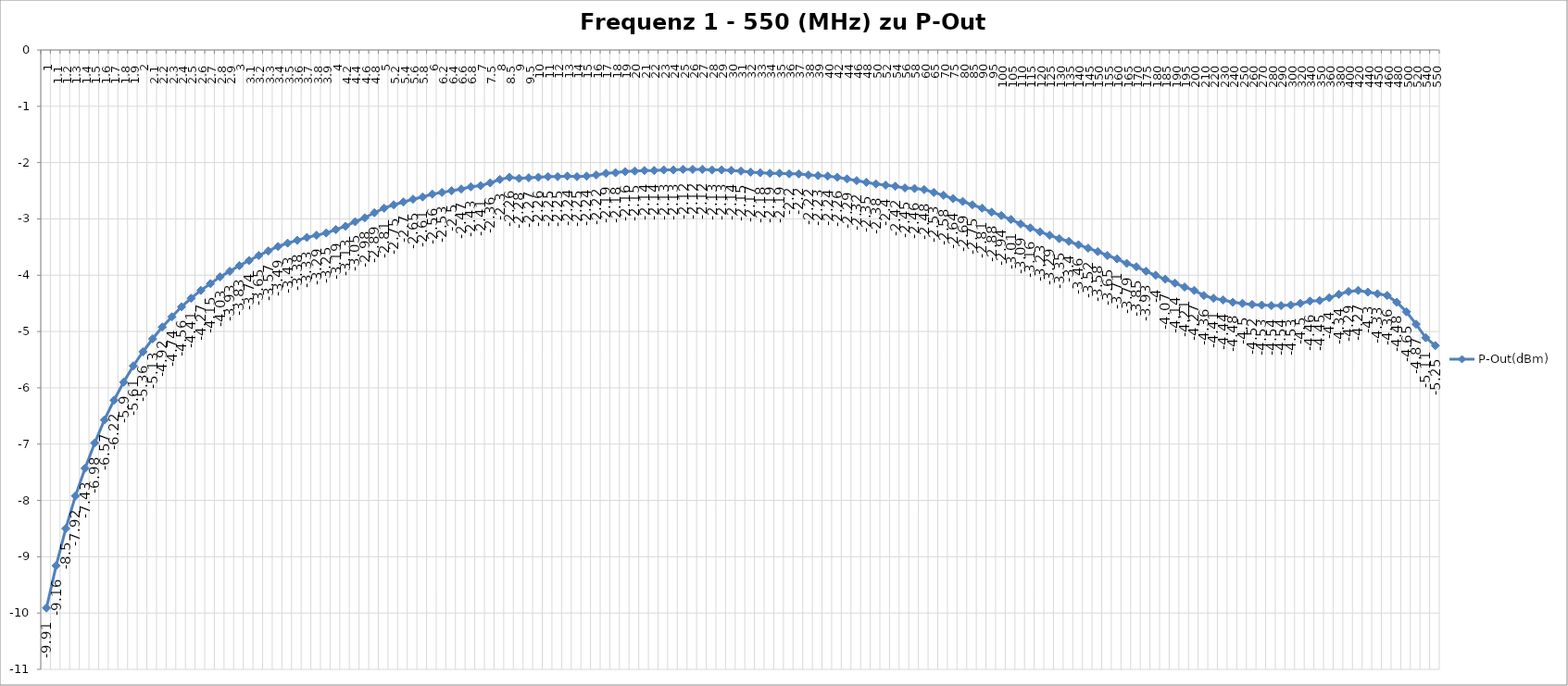
| Category | P-Out(dBm) |
|---|---|
| 1.0 | -9.91 |
| 1.1 | -9.16 |
| 1.2 | -8.5 |
| 1.3 | -7.92 |
| 1.4 | -7.43 |
| 1.5 | -6.98 |
| 1.6 | -6.57 |
| 1.7 | -6.22 |
| 1.8 | -5.9 |
| 1.9 | -5.61 |
| 2.0 | -5.36 |
| 2.1 | -5.13 |
| 2.2 | -4.92 |
| 2.3 | -4.74 |
| 2.4 | -4.56 |
| 2.5 | -4.41 |
| 2.6 | -4.27 |
| 2.7 | -4.15 |
| 2.8 | -4.03 |
| 2.9 | -3.93 |
| 3.0 | -3.83 |
| 3.1 | -3.74 |
| 3.2 | -3.65 |
| 3.3 | -3.57 |
| 3.4 | -3.49 |
| 3.5 | -3.43 |
| 3.6 | -3.38 |
| 3.7 | -3.33 |
| 3.8 | -3.29 |
| 3.9 | -3.25 |
| 4.0 | -3.19 |
| 4.2 | -3.13 |
| 4.4 | -3.05 |
| 4.6 | -2.98 |
| 4.8 | -2.89 |
| 5.0 | -2.81 |
| 5.2 | -2.75 |
| 5.4 | -2.7 |
| 5.6 | -2.65 |
| 5.8 | -2.61 |
| 6.0 | -2.56 |
| 6.2 | -2.53 |
| 6.4 | -2.5 |
| 6.6 | -2.47 |
| 6.8 | -2.43 |
| 7.0 | -2.41 |
| 7.5 | -2.36 |
| 8.0 | -2.3 |
| 8.5 | -2.26 |
| 9.0 | -2.28 |
| 9.5 | -2.27 |
| 10.0 | -2.26 |
| 11.0 | -2.25 |
| 12.0 | -2.25 |
| 13.0 | -2.24 |
| 14.0 | -2.25 |
| 15.0 | -2.24 |
| 16.0 | -2.22 |
| 17.0 | -2.19 |
| 18.0 | -2.18 |
| 19.0 | -2.16 |
| 20.0 | -2.15 |
| 21.0 | -2.14 |
| 22.0 | -2.14 |
| 23.0 | -2.13 |
| 24.0 | -2.13 |
| 25.0 | -2.12 |
| 26.0 | -2.12 |
| 27.0 | -2.12 |
| 28.0 | -2.13 |
| 29.0 | -2.13 |
| 30.0 | -2.14 |
| 31.0 | -2.15 |
| 32.0 | -2.17 |
| 33.0 | -2.18 |
| 34.0 | -2.19 |
| 35.0 | -2.19 |
| 36.0 | -2.2 |
| 37.0 | -2.2 |
| 38.0 | -2.22 |
| 39.0 | -2.23 |
| 40.0 | -2.24 |
| 42.0 | -2.26 |
| 44.0 | -2.29 |
| 46.0 | -2.32 |
| 48.0 | -2.35 |
| 50.0 | -2.38 |
| 52.0 | -2.4 |
| 54.0 | -2.42 |
| 56.0 | -2.45 |
| 58.0 | -2.46 |
| 60.0 | -2.48 |
| 65.0 | -2.53 |
| 70.0 | -2.58 |
| 75.0 | -2.64 |
| 80.0 | -2.69 |
| 85.0 | -2.75 |
| 90.0 | -2.81 |
| 95.0 | -2.88 |
| 100.0 | -2.94 |
| 105.0 | -3.01 |
| 110.0 | -3.09 |
| 115.0 | -3.16 |
| 120.0 | -3.23 |
| 125.0 | -3.29 |
| 130.0 | -3.35 |
| 135.0 | -3.4 |
| 140.0 | -3.46 |
| 145.0 | -3.52 |
| 150.0 | -3.58 |
| 155.0 | -3.65 |
| 160.0 | -3.71 |
| 165.0 | -3.79 |
| 170.0 | -3.85 |
| 175.0 | -3.93 |
| 180.0 | -4 |
| 185.0 | -4.07 |
| 190.0 | -4.14 |
| 195.0 | -4.21 |
| 200.0 | -4.27 |
| 210.0 | -4.36 |
| 220.0 | -4.41 |
| 230.0 | -4.44 |
| 240.0 | -4.48 |
| 250.0 | -4.5 |
| 260.0 | -4.52 |
| 270.0 | -4.53 |
| 280.0 | -4.54 |
| 290.0 | -4.54 |
| 300.0 | -4.53 |
| 320.0 | -4.5 |
| 340.0 | -4.46 |
| 350.0 | -4.45 |
| 360.0 | -4.4 |
| 380.0 | -4.34 |
| 400.0 | -4.29 |
| 420.0 | -4.27 |
| 440.0 | -4.3 |
| 450.0 | -4.33 |
| 460.0 | -4.36 |
| 480.0 | -4.48 |
| 500.0 | -4.65 |
| 520.0 | -4.87 |
| 540.0 | -5.11 |
| 550.0 | -5.25 |